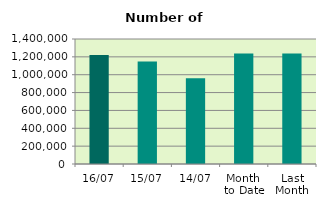
| Category | Series 0 |
|---|---|
| 16/07 | 1219804 |
| 15/07 | 1148070 |
| 14/07 | 961548 |
| Month 
to Date | 1237452.167 |
| Last
Month | 1237407.909 |